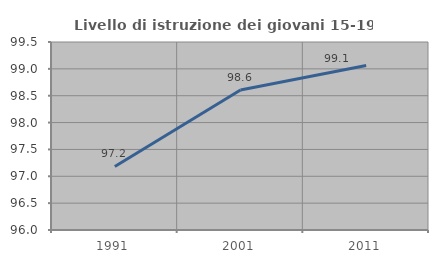
| Category | Livello di istruzione dei giovani 15-19 anni |
|---|---|
| 1991.0 | 97.183 |
| 2001.0 | 98.608 |
| 2011.0 | 99.061 |